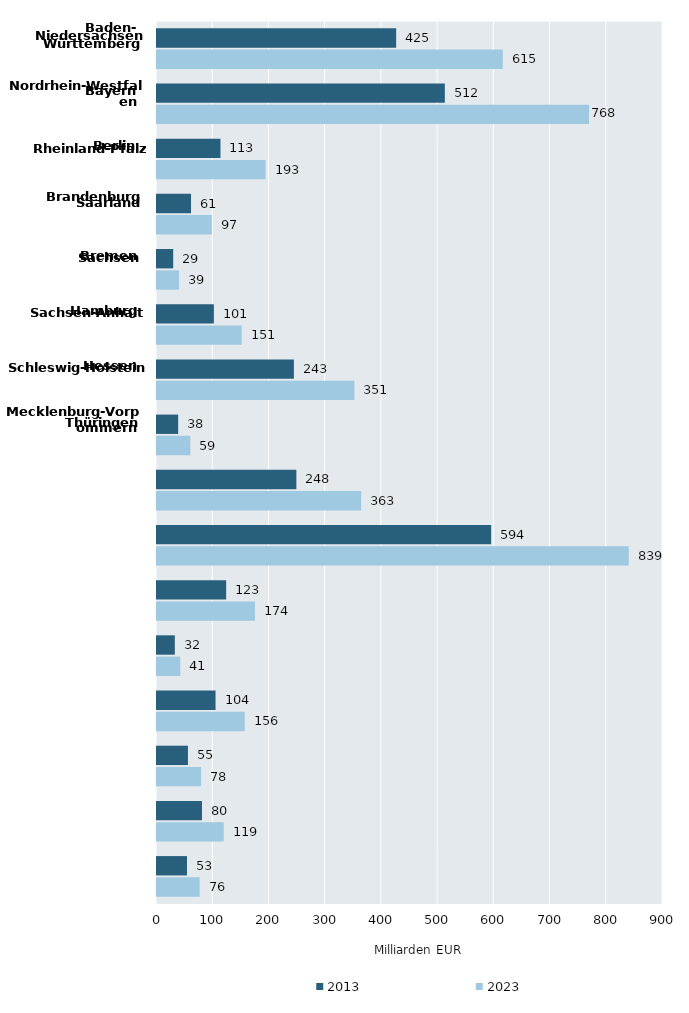
| Category | 2013 | 2023 |
|---|---|---|
| Baden-Württemberg | 425.366 | 615.071 |
| Bayern | 511.943 | 768.469 |
| Berlin | 112.881 | 193.219 |
| Brandenburg | 60.537 | 97.477 |
| Bremen | 28.824 | 39.252 |
| Hamburg | 101.145 | 150.575 |
| Hessen  | 243.459 | 351.139 |
| Mecklenburg-
Vorpommern | 37.627 | 59.217 |
| Niedersachsen | 247.883 | 363.109 |
| Nordrhein-Westfalen | 594.356 | 839.084 |
| Rheinland-Pfalz | 123.016 | 174.249 |
| Saarland | 31.716 | 41.348 |
| Sachsen | 104.139 | 155.982 |
| Sachsen-Anhalt | 55.049 | 78.38 |
| Schleswig-Holstein | 80.007 | 118.68 |
| Thüringen | 53.401 | 75.909 |